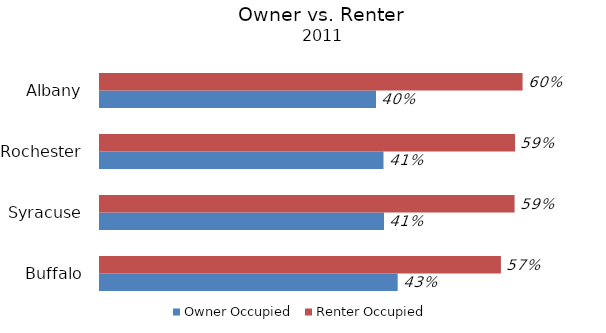
| Category | Owner Occupied | Renter Occupied |
|---|---|---|
| Buffalo | 0.426 | 0.574 |
| Syracuse | 0.407 | 0.593 |
| Rochester | 0.406 | 0.594 |
| Albany | 0.395 | 0.605 |